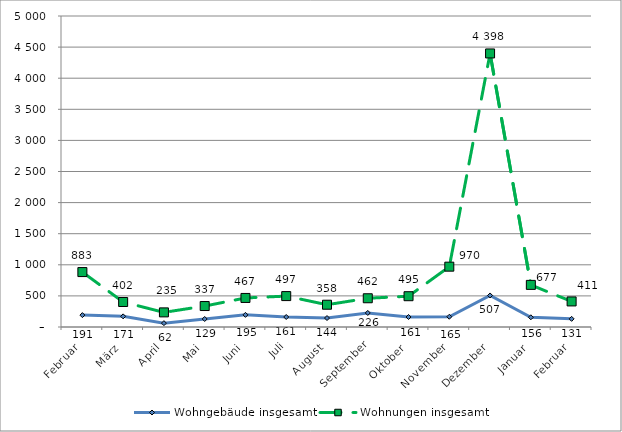
| Category | Wohngebäude insgesamt | Wohnungen insgesamt |
|---|---|---|
| Februar | 191 | 883 |
| März | 171 | 402 |
| April | 62 | 235 |
| Mai | 129 | 337 |
| Juni | 195 | 467 |
| Juli | 161 | 497 |
| August | 144 | 358 |
| September | 226 | 462 |
| Oktober | 161 | 495 |
| November | 165 | 970 |
| Dezember | 507 | 4398 |
| Januar | 156 | 677 |
| Februar | 131 | 411 |